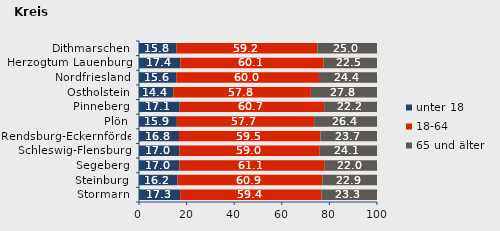
| Category | unter 18 | 18-64 | 65 und älter |
|---|---|---|---|
| Stormarn | 17.268 | 59.398 | 23.333 |
| Steinburg | 16.178 | 60.887 | 22.935 |
| Segeberg | 16.964 | 61.083 | 21.953 |
| Schleswig-Flensburg | 16.954 | 58.971 | 24.076 |
| Rendsburg-Eckernförde | 16.809 | 59.463 | 23.728 |
| Plön | 15.901 | 57.694 | 26.405 |
| Pinneberg | 17.082 | 60.721 | 22.197 |
| Ostholstein | 14.446 | 57.765 | 27.789 |
| Nordfriesland | 15.646 | 59.991 | 24.363 |
| Herzogtum Lauenburg | 17.38 | 60.138 | 22.482 |
| Dithmarschen | 15.787 | 59.212 | 25.001 |